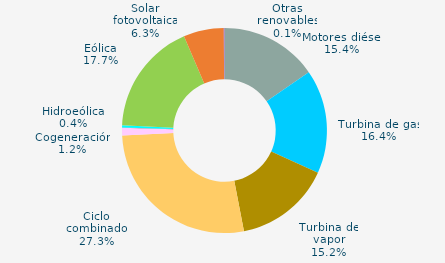
| Category | Series 0 |
|---|---|
| Motores diésel | 15.357 |
| Turbina de gas | 16.4 |
| Turbina de vapor | 15.2 |
| Ciclo combinado | 27.254 |
| Cogeneración | 1.203 |
| Hidráulica | 0.048 |
| Hidroeólica | 0.357 |
| Eólica | 17.716 |
| Solar fotovoltaica | 6.349 |
| Otras renovables | 0.116 |